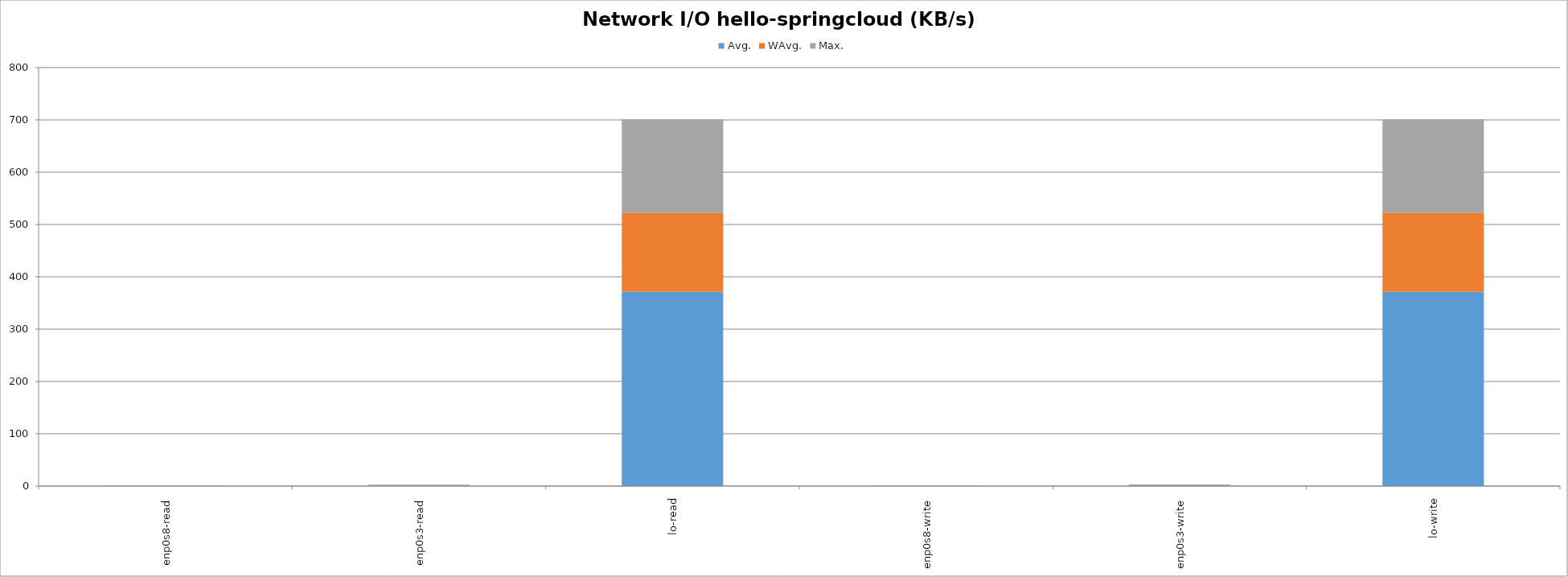
| Category | Avg. | WAvg. | Max. |
|---|---|---|---|
| enp0s8-read | 0.021 | 0.255 | 0.324 |
| enp0s3-read | 0.249 | 0.608 | 1.843 |
| lo-read | 371.553 | 151.095 | 178.552 |
| enp0s8-write | 0.018 | 0.111 | 0.071 |
| enp0s3-write | 0.498 | 0.474 | 2.129 |
| lo-write | 371.553 | 151.095 | 178.552 |